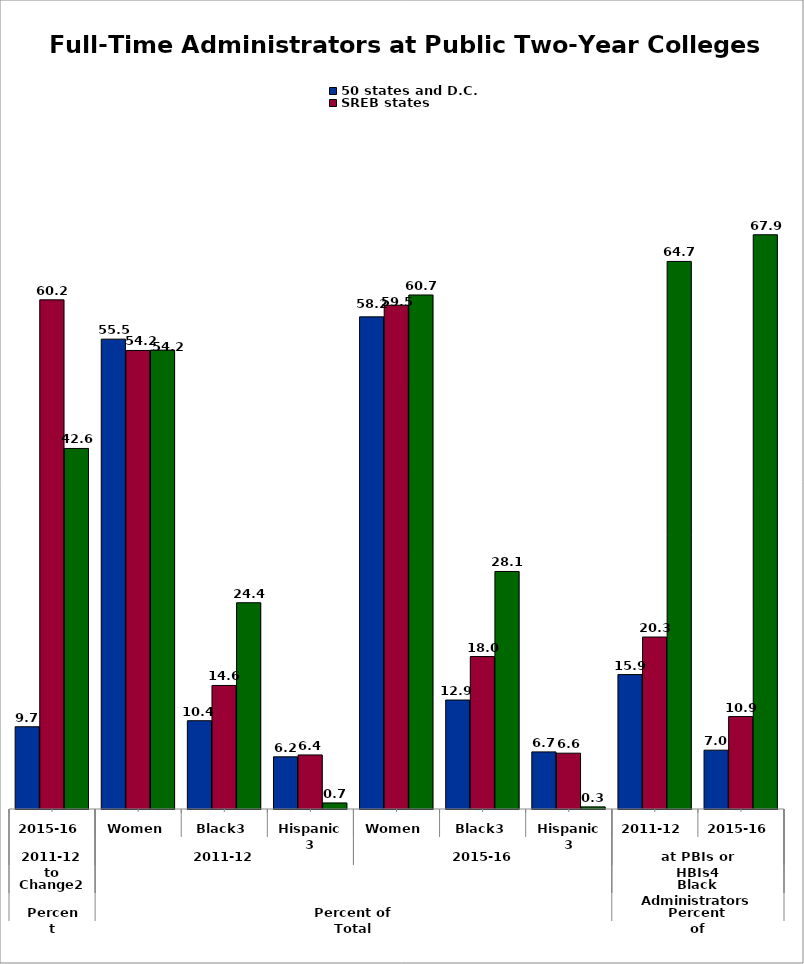
| Category | 50 states and D.C. | SREB states | State |
|---|---|---|---|
| 0 | 9.716 | 60.166 | 42.606 |
| 1 | 55.521 | 54.184 | 54.225 |
| 2 | 10.431 | 14.599 | 24.373 |
| 3 | 6.164 | 6.388 | 0.717 |
| 4 | 58.157 | 59.533 | 60.741 |
| 5 | 12.875 | 18.016 | 28.07 |
| 6 | 6.748 | 6.597 | 0.251 |
| 7 | 15.884 | 20.32 | 64.706 |
| 8 | 6.951 | 10.921 | 67.857 |